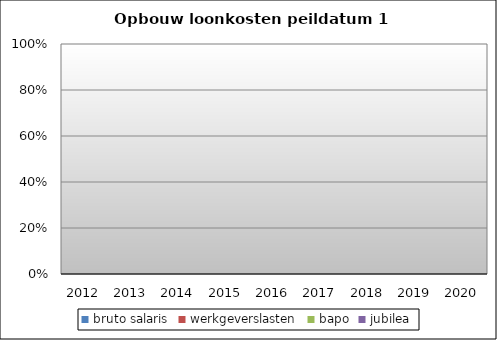
| Category | bruto salaris | werkgeverslasten | bapo | jubilea |
|---|---|---|---|---|
| 2012.0 | 0 | 0 | 0 | 0 |
| 2013.0 | 0 | 0 | 0 | 0 |
| 2014.0 | 0 | 0 | 0 | 0 |
| 2015.0 | 0 | 0 | 0 | 0 |
| 2016.0 | 0 | 0 | 0 | 0 |
| 2017.0 | 0 | 0 | 0 | 0 |
| 2018.0 | 0 | 0 | 0 | 0 |
| 2019.0 | 0 | 0 | 0 | 0 |
| 2020.0 | 0 | 0 | 0 | 0 |